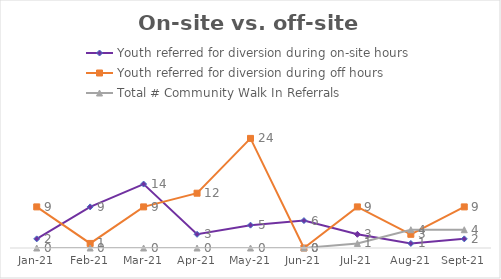
| Category | Youth referred for diversion during on-site hours | Youth referred for diversion during off hours | Total # Community Walk In Referrals |
|---|---|---|---|
| 2021-01-01 | 2 | 9 | 0 |
| 2021-02-01 | 9 | 1 | 0 |
| 2021-03-01 | 14 | 9 | 0 |
| 2021-04-01 | 3 | 12 | 0 |
| 2021-05-01 | 5 | 24 | 0 |
| 2021-06-01 | 6 | 0 | 0 |
| 2021-07-01 | 3 | 9 | 1 |
| 2021-08-01 | 1 | 3 | 4 |
| 2021-09-01 | 2 | 9 | 4 |